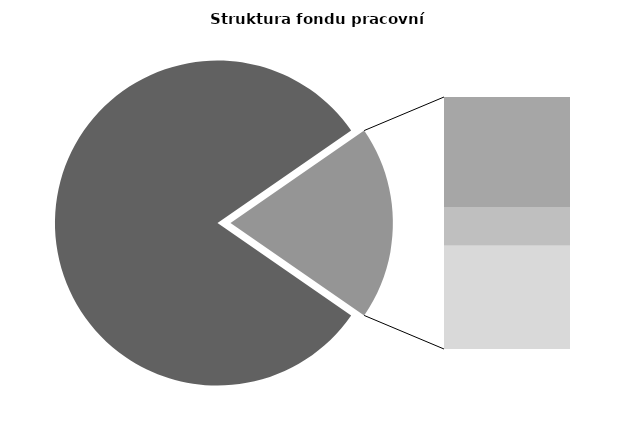
| Category | Series 0 |
|---|---|
| Průměrná měsíční odpracovaná doba bez přesčasu | 139.486 |
| Dovolená | 14.519 |
| Nemoc | 5.122 |
| Jiné | 13.628 |